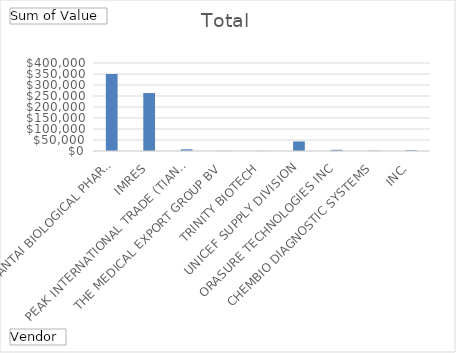
| Category | Total |
|---|---|
| BEIJING WANTAI BIOLOGICAL PHARMACY | 350350 |
| IMRES | 263450 |
| PEAK INTERNATIONAL TRADE (TIANJIN)CO LTD | 7695 |
| THE MEDICAL EXPORT GROUP BV | 772.5 |
| TRINITY BIOTECH | 537.93 |
| UNICEF SUPPLY DIVISION | 43450 |
| ORASURE TECHNOLOGIES INC | 5250 |
| CHEMBIO DIAGNOSTIC SYSTEMS, INC. | 1488 |
| INTEC PRODUCTS INC | 3250 |